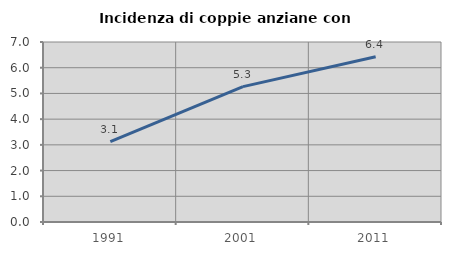
| Category | Incidenza di coppie anziane con figli |
|---|---|
| 1991.0 | 3.125 |
| 2001.0 | 5.263 |
| 2011.0 | 6.429 |